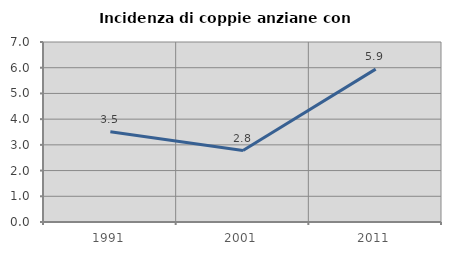
| Category | Incidenza di coppie anziane con figli |
|---|---|
| 1991.0 | 3.509 |
| 2001.0 | 2.778 |
| 2011.0 | 5.946 |